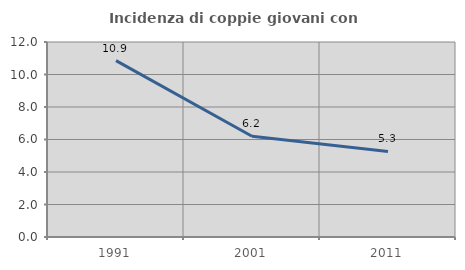
| Category | Incidenza di coppie giovani con figli |
|---|---|
| 1991.0 | 10.853 |
| 2001.0 | 6.202 |
| 2011.0 | 5.263 |